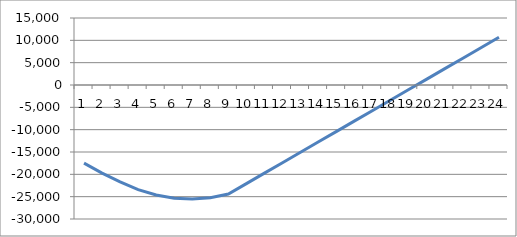
| Category | Series 0 |
|---|---|
| 0 | -17486 |
| 1 | -19718 |
| 2 | -21696 |
| 3 | -23420 |
| 4 | -24636 |
| 5 | -25344 |
| 6 | -25544 |
| 7 | -25236 |
| 8 | -24420 |
| 9 | -22080 |
| 10 | -19740 |
| 11 | -17400 |
| 12 | -15060 |
| 13 | -12720 |
| 14 | -10380 |
| 15 | -8040 |
| 16 | -5700 |
| 17 | -3360 |
| 18 | -1020 |
| 19 | 1320 |
| 20 | 3660 |
| 21 | 6000 |
| 22 | 8340 |
| 23 | 10680 |